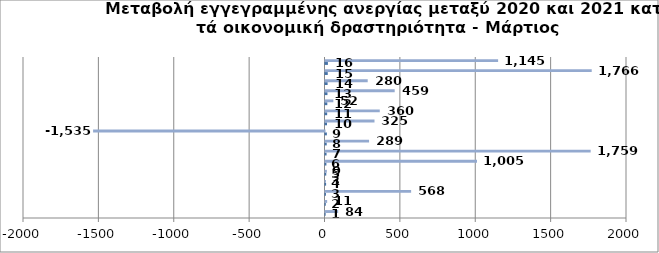
| Category | Series 0 | Series 1 |
|---|---|---|
| 0 | 1 | 84 |
| 1 | 2 | 11 |
| 2 | 3 | 568 |
| 3 | 4 | 3 |
| 4 | 5 | 9 |
| 5 | 6 | 1005 |
| 6 | 7 | 1759 |
| 7 | 8 | 289 |
| 8 | 9 | -1535 |
| 9 | 10 | 325 |
| 10 | 11 | 360 |
| 11 | 12 | 52 |
| 12 | 13 | 459 |
| 13 | 14 | 280 |
| 14 | 15 | 1766 |
| 15 | 16 | 1145 |